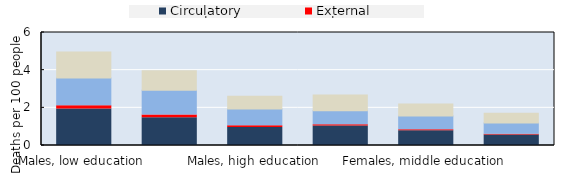
| Category | Circulatory | External | Neoplasm | Other |
|---|---|---|---|---|
| Males, low education | 1.933 | 0.183 | 1.471 | 1.373 |
| Males, middle education | 1.477 | 0.136 | 1.314 | 1.043 |
| Males, high education | 0.961 | 0.089 | 0.885 | 0.681 |
| Females, low education | 1.037 | 0.068 | 0.734 | 0.839 |
| Females, middle education | 0.78 | 0.058 | 0.731 | 0.632 |
| Females, high education | 0.557 | 0.044 | 0.595 | 0.51 |